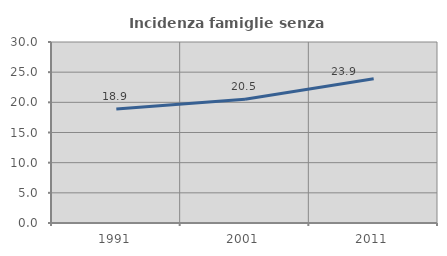
| Category | Incidenza famiglie senza nuclei |
|---|---|
| 1991.0 | 18.9 |
| 2001.0 | 20.527 |
| 2011.0 | 23.913 |